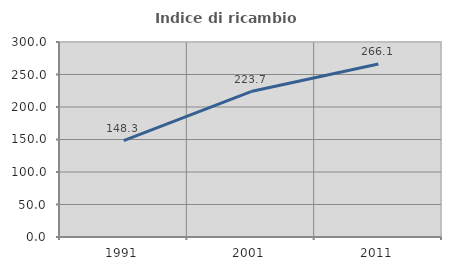
| Category | Indice di ricambio occupazionale  |
|---|---|
| 1991.0 | 148.276 |
| 2001.0 | 223.729 |
| 2011.0 | 266.102 |